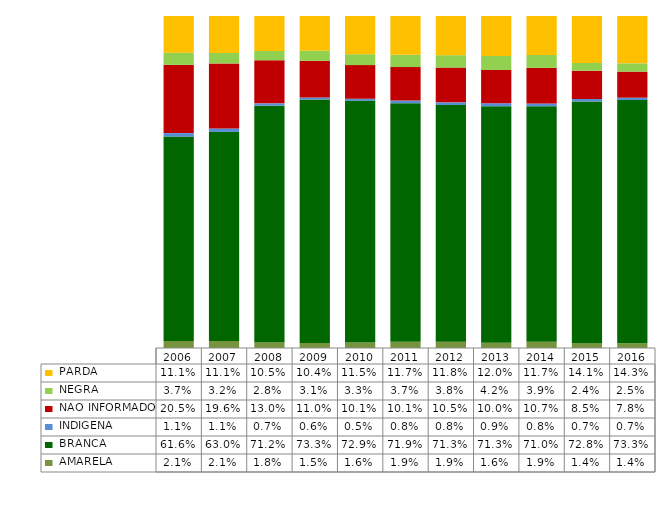
| Category |  AMARELA     |  BRANCA      |  INDIGENA    |  NAO INFORMADO  |  NEGRA       |  PARDA       |
|---|---|---|---|---|---|---|
| 2006.0 | 0.021 | 0.616 | 0.011 | 0.205 | 0.037 | 0.111 |
| 2007.0 | 0.021 | 0.63 | 0.011 | 0.196 | 0.032 | 0.111 |
| 2008.0 | 0.018 | 0.712 | 0.007 | 0.13 | 0.028 | 0.105 |
| 2009.0 | 0.015 | 0.733 | 0.006 | 0.11 | 0.031 | 0.104 |
| 2010.0 | 0.016 | 0.729 | 0.005 | 0.101 | 0.033 | 0.115 |
| 2011.0 | 0.019 | 0.719 | 0.008 | 0.101 | 0.037 | 0.117 |
| 2012.0 | 0.019 | 0.713 | 0.008 | 0.105 | 0.038 | 0.118 |
| 2013.0 | 0.016 | 0.713 | 0.009 | 0.1 | 0.042 | 0.12 |
| 2014.0 | 0.019 | 0.71 | 0.008 | 0.107 | 0.039 | 0.117 |
| 2015.0 | 0.014 | 0.728 | 0.007 | 0.085 | 0.024 | 0.141 |
| 2016.0 | 0.014 | 0.733 | 0.007 | 0.078 | 0.025 | 0.143 |